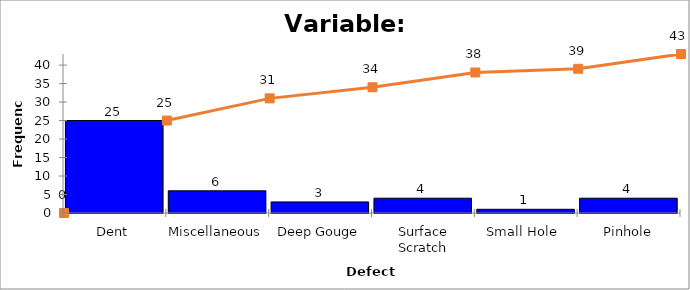
| Category | Freq |
|---|---|
| Dent | 25 |
| Miscellaneous | 6 |
| Deep Gouge | 3 |
| Surface Scratch | 4 |
| Small Hole  | 1 |
| Pinhole | 4 |